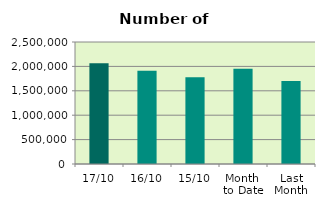
| Category | Series 0 |
|---|---|
| 17/10 | 2062832 |
| 16/10 | 1911494 |
| 15/10 | 1776010 |
| Month 
to Date | 1949409.692 |
| Last
Month | 1700207.9 |